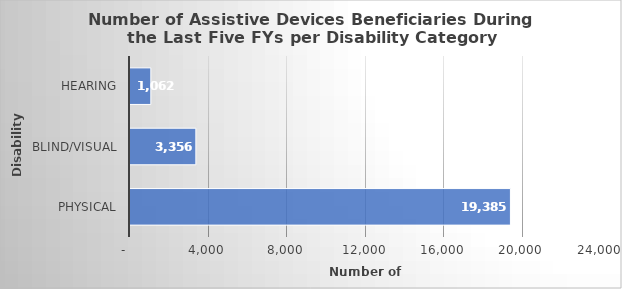
| Category | Total |
|---|---|
| PHYSICAL | 19385 |
| BLIND/VISUAL | 3356 |
| HEARING | 1062 |